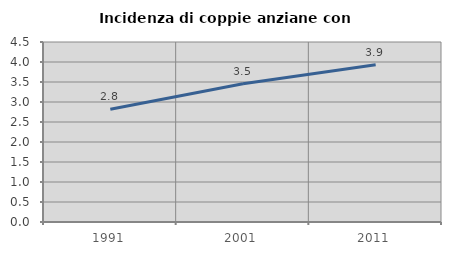
| Category | Incidenza di coppie anziane con figli |
|---|---|
| 1991.0 | 2.818 |
| 2001.0 | 3.458 |
| 2011.0 | 3.933 |